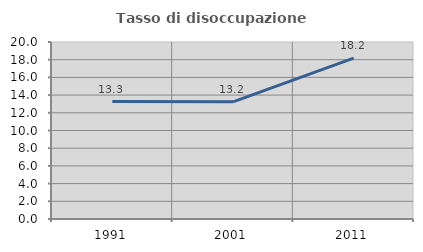
| Category | Tasso di disoccupazione giovanile  |
|---|---|
| 1991.0 | 13.265 |
| 2001.0 | 13.235 |
| 2011.0 | 18.182 |